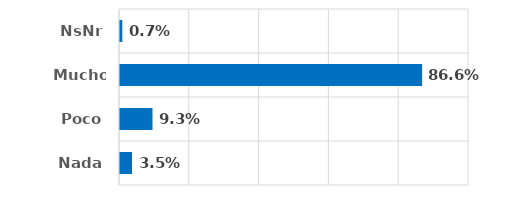
| Category | Series 0 |
|---|---|
| Nada | 0.035 |
| Poco | 0.093 |
| Mucho | 0.866 |
| NsNr | 0.007 |